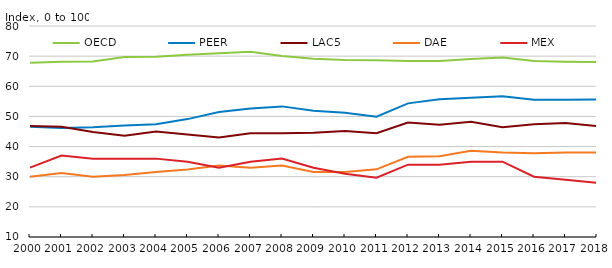
| Category | OECD | PEER | LAC5 | DAE | MEX |
|---|---|---|---|---|---|
| 2000.0 | 67.824 | 46.6 | 46.8 | 30 | 33 |
| 2001.0 | 68.147 | 46.2 | 46.6 | 31.2 | 37 |
| 2002.0 | 68.235 | 46.4 | 44.8 | 30 | 36 |
| 2003.0 | 69.727 | 47 | 43.6 | 30.6 | 36 |
| 2004.0 | 69.788 | 47.444 | 45 | 31.6 | 36 |
| 2005.0 | 70.485 | 49.111 | 44 | 32.4 | 35 |
| 2006.0 | 70.939 | 51.444 | 43 | 33.75 | 33 |
| 2007.0 | 71.469 | 52.667 | 44.4 | 33 | 35 |
| 2008.0 | 70.061 | 53.333 | 44.4 | 33.75 | 36 |
| 2009.0 | 69.143 | 51.889 | 44.6 | 31.6 | 33 |
| 2010.0 | 68.686 | 51.222 | 45.2 | 31.6 | 31 |
| 2011.0 | 68.606 | 49.889 | 44.46 | 32.44 | 29.7 |
| 2012.0 | 68.429 | 54.333 | 48 | 36.6 | 34 |
| 2013.0 | 68.4 | 55.667 | 47.2 | 36.8 | 34 |
| 2014.0 | 69.057 | 56.222 | 48.2 | 38.6 | 35 |
| 2015.0 | 69.559 | 56.667 | 46.4 | 38 | 35 |
| 2016.0 | 68.361 | 55.5 | 47.4 | 37.8 | 30 |
| 2017.0 | 68.111 | 55.5 | 47.8 | 38 | 29 |
| 2018.0 | 68.028 | 55.6 | 46.8 | 38 | 28 |